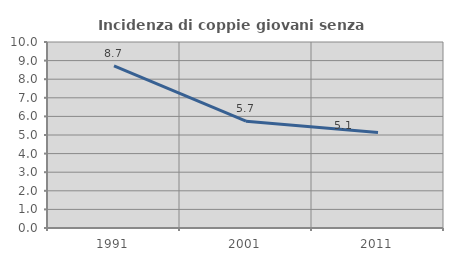
| Category | Incidenza di coppie giovani senza figli |
|---|---|
| 1991.0 | 8.715 |
| 2001.0 | 5.74 |
| 2011.0 | 5.13 |